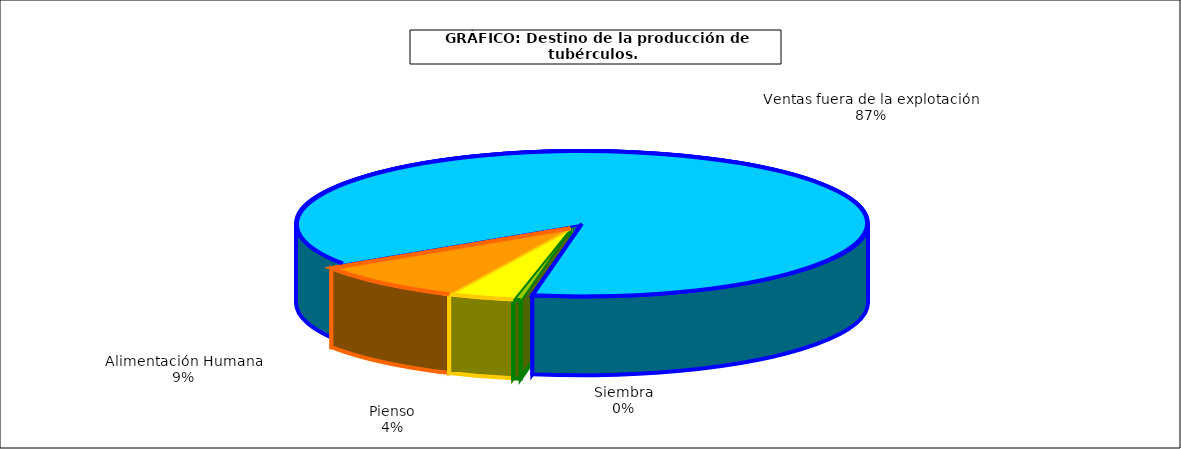
| Category | Series 0 |
|---|---|
| 0 | 8421 |
| 1 | 74162 |
| 2 | 173435 |
| 3 | 1718500 |